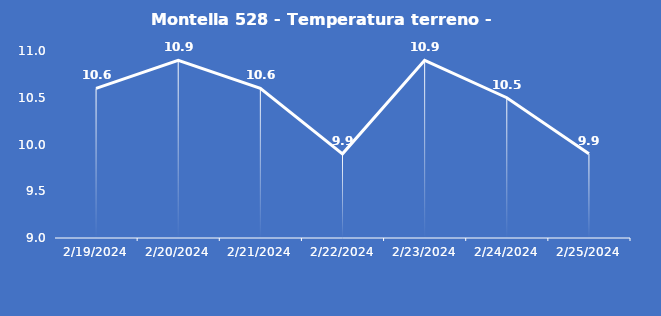
| Category | Montella 528 - Temperatura terreno - Grezzo (°C) |
|---|---|
| 2/19/24 | 10.6 |
| 2/20/24 | 10.9 |
| 2/21/24 | 10.6 |
| 2/22/24 | 9.9 |
| 2/23/24 | 10.9 |
| 2/24/24 | 10.5 |
| 2/25/24 | 9.9 |